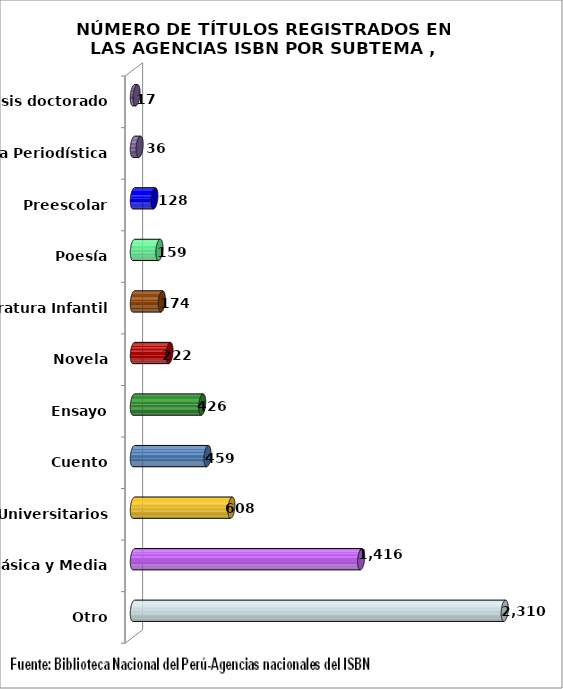
| Category | Series 0 |
|---|---|
| Otro | 2310 |
| Educación Básica y Media | 1416 |
| Libros Universitarios | 608 |
| Cuento | 459 |
| Ensayo | 426 |
| Novela | 222 |
| Literatura Infantil | 174 |
| Poesía | 159 |
| Preescolar | 128 |
| Crónica Periodística | 36 |
| Tesis doctorado | 17 |